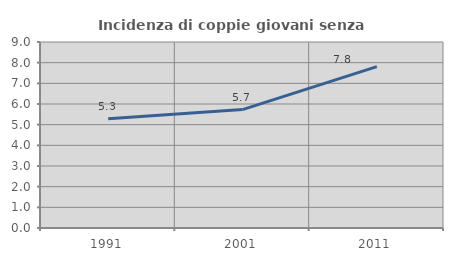
| Category | Incidenza di coppie giovani senza figli |
|---|---|
| 1991.0 | 5.285 |
| 2001.0 | 5.73 |
| 2011.0 | 7.808 |